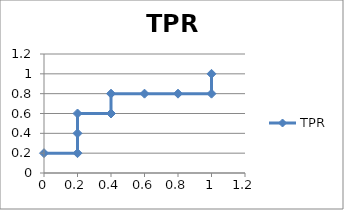
| Category | TPR |
|---|---|
| 0.0 | 0.2 |
| 0.2 | 0.2 |
| 0.2 | 0.4 |
| 0.2 | 0.6 |
| 0.4 | 0.6 |
| 0.4 | 0.8 |
| 0.6 | 0.8 |
| 0.8 | 0.8 |
| 1.0 | 0.8 |
| 1.0 | 1 |